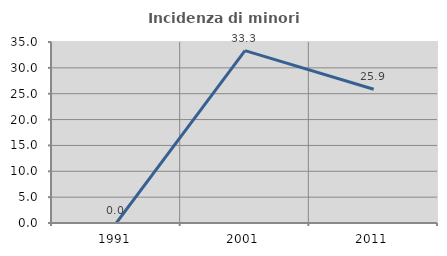
| Category | Incidenza di minori stranieri |
|---|---|
| 1991.0 | 0 |
| 2001.0 | 33.333 |
| 2011.0 | 25.862 |